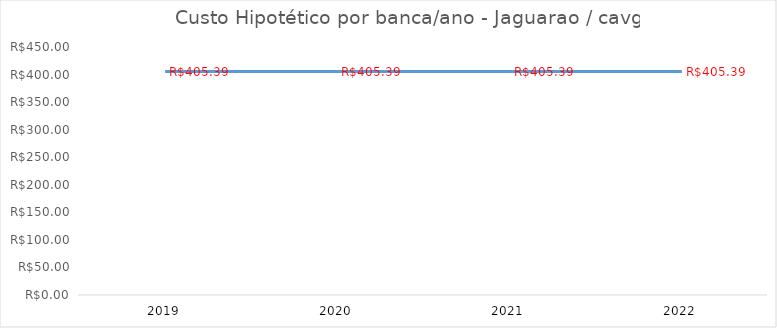
| Category | Series 0 |
|---|---|
| 2019.0 | 405.39 |
| 2020.0 | 405.39 |
| 2021.0 | 405.39 |
| 2022.0 | 405.39 |